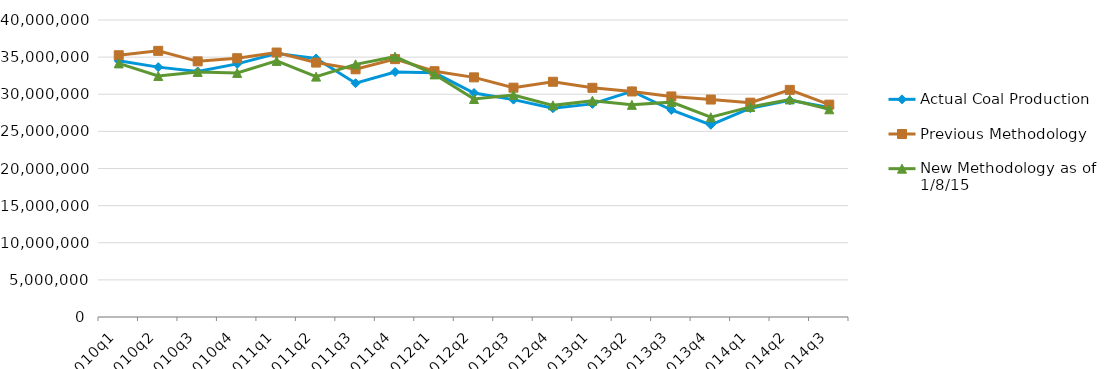
| Category | Actual Coal Production | Previous Methodology | New Methodology as of 1/8/15 |
|---|---|---|---|
| 2010q1 | 34507782 | 35250899 | 34157621 |
| 2010q2 | 33653419 | 35842098 | 32460106 |
| 2010q3 | 33056147 | 34430126 | 33004057 |
| 2010q4 | 34089172 | 34852704 | 32870711 |
| 2011q1 | 35472894 | 35616892 | 34487271 |
| 2011q2 | 34824416 | 34265701 | 32374635 |
| 2011q3 | 31484298 | 33361226 | 34027327 |
| 2011q4 | 33003071 | 34731186 | 35058886 |
| 2012q1 | 32889387 | 33106439 | 32673161 |
| 2012q2 | 30168041 | 32275762 | 29356781 |
| 2012q3 | 29273366 | 30885135 | 29900534 |
| 2012q4 | 28117759 | 31683253 | 28503826 |
| 2013q1 | 28703416 | 30867762 | 29135521 |
| 2013q2 | 30405495 | 30375215 | 28573723 |
| 2013q3 | 27880761 | 29704595 | 28937044 |
| 2013q4 | 25886119 | 29286713 | 26901026 |
| 2014q1 | 28126505 | 28864779 | 28295237 |
| 2014q2 | 29176297 | 30588972 | 29300547 |
| 2014q3 | 28203087 | 28599156 | 27973306 |